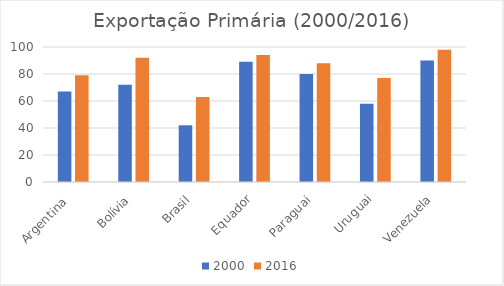
| Category | 2000 | 2016 |
|---|---|---|
| Argentina  | 67 | 79 |
| Bolívia | 72 | 92 |
| Brasil | 42 | 63 |
| Equador | 89 | 94 |
| Paraguai | 80 | 88 |
| Uruguai | 58 | 77 |
| Venezuela | 90 | 98 |